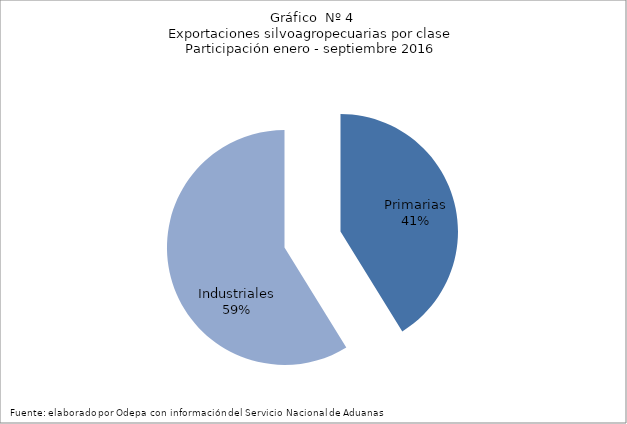
| Category | Series 0 |
|---|---|
| Primarias | 4741837 |
| Industriales | 6771722 |